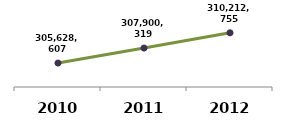
| Category | Series 0 |
|---|---|
| 2010.0 | 305628607 |
| 2011.0 | 307900319 |
| 2012.0 | 310212755 |